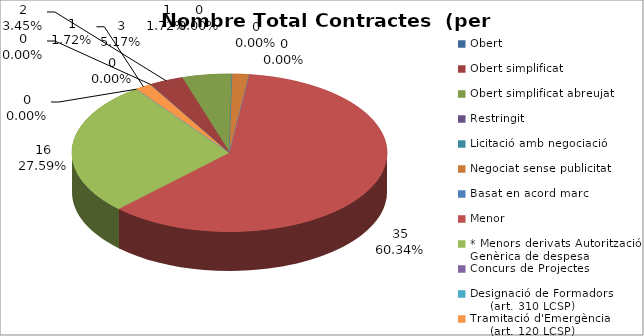
| Category | Nombre Total Contractes |
|---|---|
| Obert | 0 |
| Obert simplificat | 2 |
| Obert simplificat abreujat | 3 |
| Restringit | 0 |
| Licitació amb negociació | 0 |
| Negociat sense publicitat | 1 |
| Basat en acord marc | 0 |
| Menor | 35 |
| * Menors derivats Autorització Genèrica de despesa | 16 |
| Concurs de Projectes | 0 |
| Designació de Formadors
     (art. 310 LCSP) | 0 |
| Tramitació d'Emergència
     (art. 120 LCSP) | 1 |